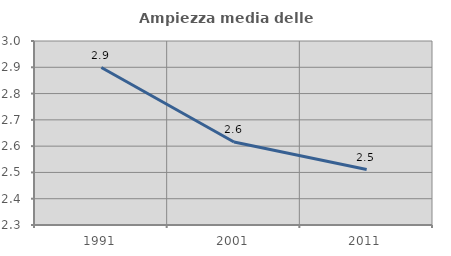
| Category | Ampiezza media delle famiglie |
|---|---|
| 1991.0 | 2.899 |
| 2001.0 | 2.616 |
| 2011.0 | 2.511 |